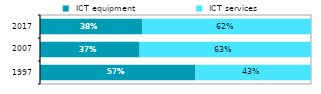
| Category |  ICT equipment |  ICT services |
|---|---|---|
| 1997.0 | 0.574 | 0.426 |
| 2007.0 | 0.367 | 0.633 |
| 2017.0 | 0.378 | 0.622 |